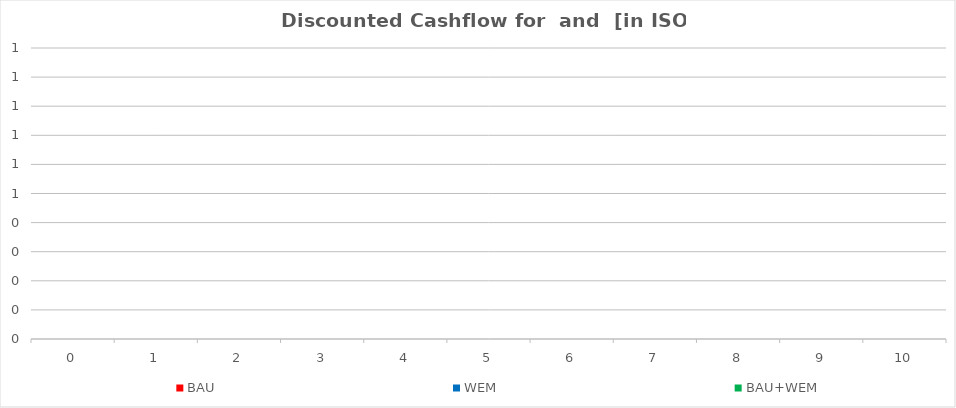
| Category | BAU | WEM | BAU+WEM |
|---|---|---|---|
| 0.0 | 0 |  |  |
| 1.0 | 0 |  |  |
| 2.0 | 0 |  |  |
| 3.0 | 0 |  |  |
| 4.0 | 0 |  |  |
| 5.0 | 0 |  |  |
| 6.0 | 0 |  |  |
| 7.0 | 0 |  |  |
| 8.0 | 0 |  |  |
| 9.0 | 0 |  |  |
| 10.0 | 0 |  |  |